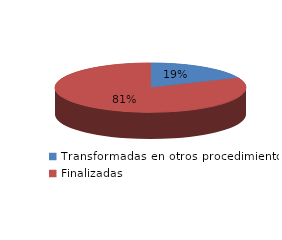
| Category | Series 0 |
|---|---|
| Transformadas en otros procedimientos | 2338 |
| Finalizadas | 10287 |